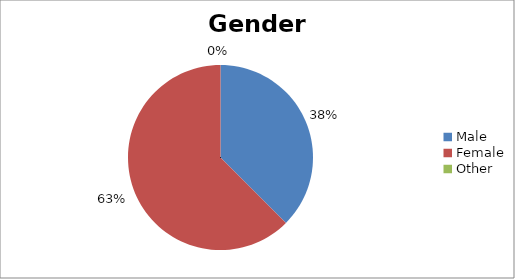
| Category | Gender |
|---|---|
| Male | 3 |
| Female | 5 |
| Other | 0 |